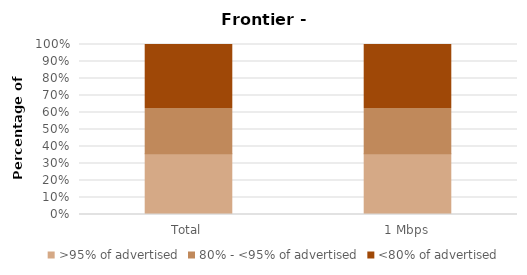
| Category | >95% of advertised | 80% - <95% of advertised | <80% of advertised |
|---|---|---|---|
| Total | 0.358 | 0.266 | 0.376 |
| 1 Mbps | 0.358 | 0.266 | 0.376 |